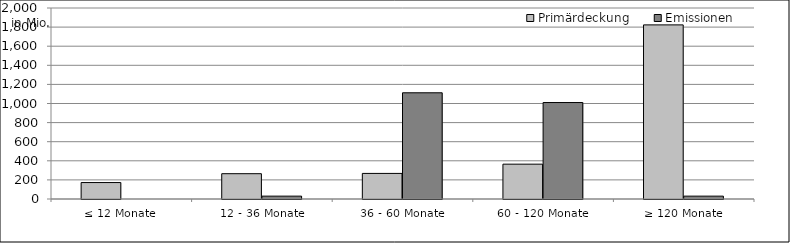
| Category | Primärdeckung | Emissionen |
|---|---|---|
| ≤ 12 Monate | 172159226.335 | 0 |
| 12 - 36 Monate | 265028266.712 | 30000000 |
| 36 - 60 Monate | 267960646.529 | 1112086000 |
| 60 - 120 Monate | 364736330.145 | 1010000000 |
| ≥ 120 Monate | 1823274198.52 | 30000000 |